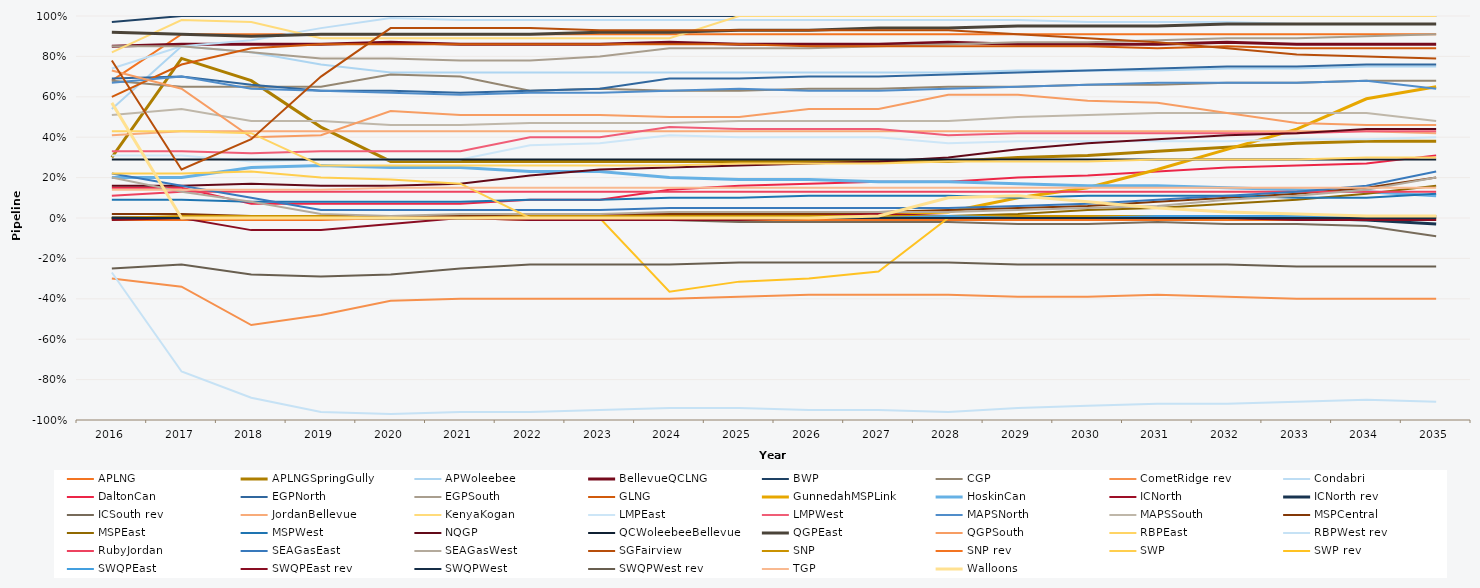
| Category | APLNG | APLNGSpringGully | APWoleebee | BellevueQCLNG | BWP | CGP | CometRidge rev | Condabri | DaltonCan | EGPNorth | EGPSouth | GLNG | GunnedahMSPLink | HoskinCan | ICNorth | ICNorth rev | ICSouth rev | JordanBellevue | KenyaKogan | LMPEast | LMPWest | MAPSNorth | MAPSSouth | MSPCentral | MSPEast | MSPWest | NQGP | QCWoleebeeBellevue | QGPEast | QGPSouth | RBPEast | RBPWest rev | RubyJordan | SEAGasEast | SEAGasWest | SGFairview | SNP | SNP rev | SWP | SWP rev | SWQPEast | SWQPEast rev | SWQPWest | SWQPWest rev | TGP | Walloons |
|---|---|---|---|---|---|---|---|---|---|---|---|---|---|---|---|---|---|---|---|---|---|---|---|---|---|---|---|---|---|---|---|---|---|---|---|---|---|---|---|---|---|---|---|---|---|---|
| 2016.0 | 0.68 | 0.3 | 0.54 | 0.85 | 0.97 | 0.68 | -0.3 | 0.74 | 0.15 | 0.69 | 0.85 | 0.6 | 0 | 0.2 | 0 | 0 | 0 | 0.41 | 0.82 | 0.31 | 0.33 | 0.67 | 0.51 | 0.02 | 0 | 0.09 | 0.16 | 0.29 | 0.92 | 0.73 | 0.43 | -0.27 | 0.11 | 0.22 | 0.2 | 0.78 | 0 | -0.01 | 0.22 | 0 | 0 | -0.01 | 0 | -0.25 | 0.14 | 0.57 |
| 2017.0 | 0.91 | 0.79 | 0.85 | 0.86 | 1 | 0.65 | -0.34 | 0.85 | 0.15 | 0.7 | 0.85 | 0.76 | 0 | 0.2 | 0 | 0 | 0 | 0.43 | 0.98 | 0.31 | 0.33 | 0.7 | 0.54 | 0.02 | 0 | 0.09 | 0.16 | 0.29 | 0.91 | 0.64 | 0.43 | -0.76 | 0.13 | 0.16 | 0.13 | 0.24 | 0.01 | -0.01 | 0.22 | 0 | 0 | 0 | 0 | -0.23 | 0.14 | 0 |
| 2018.0 | 0.91 | 0.68 | 0.82 | 0.86 | 1 | 0.65 | -0.53 | 0.88 | 0.07 | 0.66 | 0.82 | 0.84 | 0 | 0.25 | 0 | 0 | 0 | 0.43 | 0.97 | 0.28 | 0.32 | 0.64 | 0.48 | 0.01 | 0 | 0.08 | 0.17 | 0.29 | 0.9 | 0.4 | 0.42 | -0.89 | 0.13 | 0.1 | 0.08 | 0.39 | 0.01 | -0.01 | 0.23 | 0 | 0 | -0.06 | 0 | -0.28 | 0.14 | 0 |
| 2019.0 | 0.91 | 0.45 | 0.76 | 0.86 | 1 | 0.65 | -0.48 | 0.94 | 0.07 | 0.63 | 0.79 | 0.86 | 0 | 0.26 | 0 | 0 | 0 | 0.43 | 0.89 | 0.29 | 0.33 | 0.63 | 0.48 | 0.01 | 0 | 0.08 | 0.16 | 0.29 | 0.91 | 0.41 | 0.26 | -0.96 | 0.13 | 0.04 | 0.02 | 0.7 | 0.01 | -0.01 | 0.2 | 0 | 0 | -0.06 | 0 | -0.29 | 0.14 | 0 |
| 2020.0 | 0.91 | 0.28 | 0.72 | 0.87 | 1 | 0.71 | -0.41 | 0.99 | 0.07 | 0.63 | 0.79 | 0.86 | 0 | 0.25 | 0 | 0 | 0 | 0.43 | 0.89 | 0.29 | 0.33 | 0.62 | 0.46 | 0.01 | 0 | 0.08 | 0.16 | 0.29 | 0.91 | 0.53 | 0.26 | -0.97 | 0.13 | 0.04 | 0.01 | 0.94 | 0 | 0 | 0.19 | 0 | 0 | -0.03 | 0 | -0.28 | 0.15 | 0 |
| 2021.0 | 0.91 | 0.28 | 0.72 | 0.86 | 1 | 0.7 | -0.4 | 0.98 | 0.07 | 0.62 | 0.78 | 0.86 | 0 | 0.25 | 0 | 0 | 0 | 0.43 | 0.89 | 0.29 | 0.33 | 0.61 | 0.46 | 0.01 | 0 | 0.08 | 0.17 | 0.29 | 0.91 | 0.51 | 0.26 | -0.96 | 0.13 | 0.04 | 0.02 | 0.94 | 0 | 0 | 0.17 | 0 | 0 | 0 | 0 | -0.25 | 0.15 | 0 |
| 2022.0 | 0.91 | 0.28 | 0.72 | 0.86 | 1 | 0.63 | -0.4 | 0.98 | 0.09 | 0.63 | 0.78 | 0.86 | 0 | 0.23 | 0.01 | 0 | 0 | 0.43 | 0.89 | 0.36 | 0.4 | 0.62 | 0.47 | 0.01 | 0 | 0.09 | 0.21 | 0.29 | 0.91 | 0.51 | 0.26 | -0.96 | 0.13 | 0.04 | 0.02 | 0.94 | 0.01 | -0.01 | 0 | 0 | 0 | -0.01 | 0 | -0.23 | 0.15 | 0 |
| 2023.0 | 0.91 | 0.28 | 0.72 | 0.86 | 1 | 0.64 | -0.4 | 0.98 | 0.09 | 0.64 | 0.8 | 0.86 | 0 | 0.23 | 0.02 | 0 | -0.01 | 0.43 | 0.89 | 0.37 | 0.4 | 0.62 | 0.47 | 0.01 | 0 | 0.09 | 0.24 | 0.29 | 0.92 | 0.51 | 0.26 | -0.95 | 0.13 | 0.04 | 0.02 | 0.93 | 0.01 | -0.01 | 0 | 0 | 0 | -0.01 | 0 | -0.23 | 0.15 | 0 |
| 2024.0 | 0.91 | 0.28 | 0.72 | 0.87 | 1 | 0.63 | -0.4 | 0.98 | 0.14 | 0.69 | 0.84 | 0.86 | 0 | 0.2 | 0.02 | 0 | -0.01 | 0.43 | 0.89 | 0.41 | 0.45 | 0.63 | 0.47 | 0.02 | 0 | 0.1 | 0.25 | 0.29 | 0.92 | 0.5 | 0.26 | -0.94 | 0.13 | 0.05 | 0.03 | 0.93 | 0.01 | -0.01 | 0 | -0.365 | 0 | -0.01 | 0 | -0.23 | 0.15 | 0 |
| 2025.0 | 0.91 | 0.28 | 0.72 | 0.86 | 1 | 0.63 | -0.39 | 0.98 | 0.16 | 0.69 | 0.84 | 0.86 | 0 | 0.19 | 0.03 | 0 | -0.02 | 0.43 | 1 | 0.4 | 0.44 | 0.64 | 0.48 | 0.02 | 0 | 0.1 | 0.26 | 0.29 | 0.93 | 0.5 | 0.27 | -0.94 | 0.13 | 0.05 | 0.03 | 0.93 | 0.01 | -0.01 | 0 | -0.315 | 0 | -0.01 | 0 | -0.22 | 0.15 | 0 |
| 2026.0 | 0.91 | 0.28 | 0.72 | 0.86 | 1 | 0.64 | -0.38 | 0.98 | 0.17 | 0.7 | 0.84 | 0.85 | 0.01 | 0.19 | 0.02 | 0 | -0.02 | 0.43 | 1 | 0.4 | 0.44 | 0.63 | 0.48 | 0.02 | 0 | 0.11 | 0.27 | 0.29 | 0.93 | 0.54 | 0.27 | -0.95 | 0.13 | 0.05 | 0.03 | 0.93 | 0.01 | -0.01 | 0 | -0.3 | 0 | 0 | 0 | -0.22 | 0.15 | 0 |
| 2027.0 | 0.91 | 0.28 | 0.72 | 0.86 | 1 | 0.64 | -0.38 | 0.98 | 0.18 | 0.7 | 0.85 | 0.85 | 0.02 | 0.18 | 0.02 | 0 | -0.02 | 0.43 | 1 | 0.4 | 0.44 | 0.63 | 0.48 | 0.03 | 0.01 | 0.11 | 0.28 | 0.29 | 0.94 | 0.54 | 0.27 | -0.95 | 0.13 | 0.05 | 0.03 | 0.93 | 0.01 | -0.01 | 0 | -0.265 | 0 | 0 | 0 | -0.22 | 0.15 | 0.01 |
| 2028.0 | 0.91 | 0.28 | 0.72 | 0.87 | 1 | 0.65 | -0.38 | 0.98 | 0.18 | 0.71 | 0.86 | 0.85 | 0.03 | 0.18 | 0.01 | 0 | -0.02 | 0.43 | 1 | 0.37 | 0.41 | 0.64 | 0.48 | 0.04 | 0.01 | 0.11 | 0.3 | 0.29 | 0.94 | 0.61 | 0.28 | -0.96 | 0.13 | 0.05 | 0.03 | 0.93 | 0.01 | -0.01 | 0 | 0 | 0.01 | 0 | 0 | -0.22 | 0.15 | 0.1 |
| 2029.0 | 0.91 | 0.3 | 0.73 | 0.86 | 1 | 0.65 | -0.39 | 0.98 | 0.2 | 0.72 | 0.87 | 0.85 | 0.1 | 0.17 | 0 | 0 | -0.03 | 0.43 | 1 | 0.38 | 0.42 | 0.65 | 0.5 | 0.05 | 0.02 | 0.1 | 0.34 | 0.29 | 0.95 | 0.61 | 0.28 | -0.94 | 0.13 | 0.06 | 0.04 | 0.91 | 0.01 | -0.01 | 0 | 0 | 0 | 0 | 0 | -0.23 | 0.15 | 0.11 |
| 2030.0 | 0.91 | 0.31 | 0.73 | 0.86 | 1 | 0.66 | -0.39 | 0.97 | 0.21 | 0.73 | 0.87 | 0.85 | 0.15 | 0.16 | 0 | 0 | -0.03 | 0.43 | 1 | 0.38 | 0.42 | 0.66 | 0.51 | 0.06 | 0.04 | 0.11 | 0.37 | 0.29 | 0.95 | 0.58 | 0.28 | -0.93 | 0.13 | 0.07 | 0.05 | 0.89 | 0.01 | -0.01 | 0 | 0 | 0 | 0 | 0 | -0.23 | 0.15 | 0.08 |
| 2031.0 | 0.91 | 0.33 | 0.73 | 0.86 | 1 | 0.66 | -0.38 | 0.97 | 0.23 | 0.74 | 0.88 | 0.84 | 0.24 | 0.16 | 0 | 0 | -0.02 | 0.43 | 1 | 0.38 | 0.42 | 0.67 | 0.52 | 0.08 | 0.05 | 0.11 | 0.39 | 0.29 | 0.95 | 0.57 | 0.29 | -0.92 | 0.13 | 0.09 | 0.06 | 0.87 | 0.01 | -0.01 | 0 | 0 | 0.01 | 0 | 0 | -0.23 | 0.15 | 0.05 |
| 2032.0 | 0.91 | 0.35 | 0.74 | 0.87 | 1 | 0.67 | -0.39 | 0.97 | 0.25 | 0.75 | 0.89 | 0.85 | 0.34 | 0.15 | 0 | 0 | -0.03 | 0.43 | 1 | 0.38 | 0.42 | 0.67 | 0.52 | 0.1 | 0.07 | 0.11 | 0.41 | 0.29 | 0.96 | 0.52 | 0.29 | -0.92 | 0.13 | 0.11 | 0.09 | 0.84 | 0.01 | -0.01 | 0 | 0 | 0.01 | 0 | 0 | -0.23 | 0.15 | 0.03 |
| 2033.0 | 0.91 | 0.37 | 0.74 | 0.86 | 1 | 0.67 | -0.4 | 0.96 | 0.26 | 0.75 | 0.89 | 0.84 | 0.44 | 0.14 | 0 | 0 | -0.03 | 0.43 | 1 | 0.39 | 0.42 | 0.67 | 0.52 | 0.12 | 0.09 | 0.1 | 0.42 | 0.29 | 0.96 | 0.47 | 0.29 | -0.91 | 0.13 | 0.13 | 0.11 | 0.81 | 0.01 | -0.01 | 0 | 0 | 0.01 | -0.01 | 0 | -0.24 | 0.15 | 0.02 |
| 2034.0 | 0.91 | 0.38 | 0.75 | 0.86 | 1 | 0.68 | -0.4 | 0.96 | 0.27 | 0.76 | 0.9 | 0.84 | 0.59 | 0.13 | 0 | -0.01 | -0.04 | 0.43 | 1 | 0.39 | 0.43 | 0.68 | 0.52 | 0.15 | 0.12 | 0.1 | 0.44 | 0.29 | 0.96 | 0.46 | 0.3 | -0.9 | 0.13 | 0.16 | 0.14 | 0.8 | 0.01 | -0.01 | 0 | 0 | 0.01 | -0.01 | 0 | -0.24 | 0.15 | 0.01 |
| 2035.0 | 0.91 | 0.38 | 0.75 | 0.86 | 1 | 0.68 | -0.4 | 0.96 | 0.31 | 0.76 | 0.91 | 0.84 | 0.65 | 0.11 | 0 | -0.03 | -0.09 | 0.42 | 1 | 0.4 | 0.43 | 0.64 | 0.48 | 0.2 | 0.16 | 0.12 | 0.44 | 0.29 | 0.96 | 0.46 | 0.3 | -0.91 | 0.13 | 0.23 | 0.2 | 0.79 | 0.01 | -0.01 | 0.01 | 0 | 0.01 | -0.01 | 0 | -0.24 | 0.15 | 0.01 |